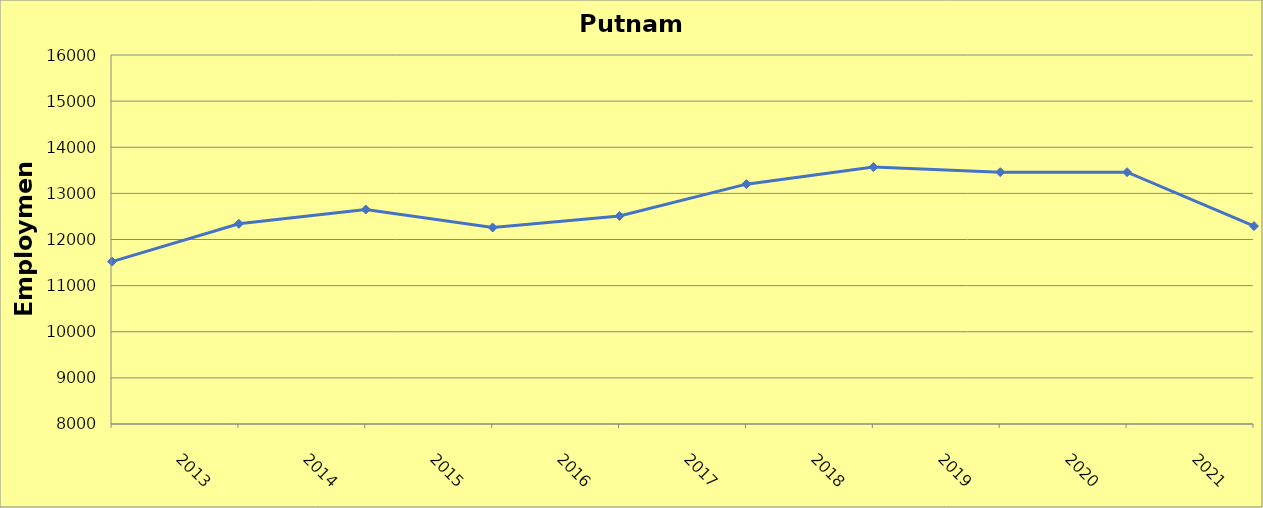
| Category | Putnam County |
|---|---|
| 2013.0 | 11520 |
| 2014.0 | 12340 |
| 2015.0 | 12650 |
| 2016.0 | 12260 |
| 2017.0 | 12510 |
| 2018.0 | 13200 |
| 2019.0 | 13570 |
| 2020.0 | 13460 |
| 2021.0 | 13460 |
| 2022.0 | 12290 |